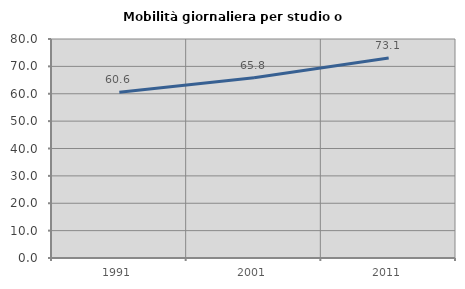
| Category | Mobilità giornaliera per studio o lavoro |
|---|---|
| 1991.0 | 60.588 |
| 2001.0 | 65.837 |
| 2011.0 | 73.096 |